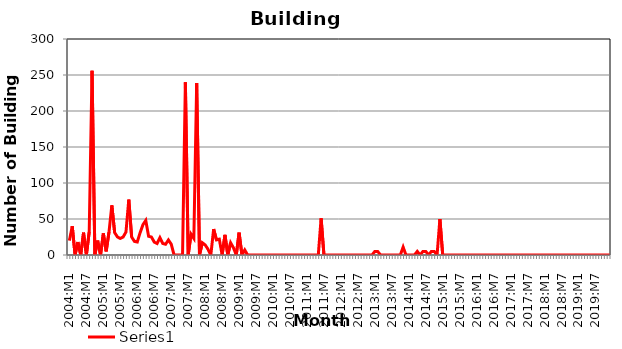
| Category | Series 0 |
|---|---|
| 2004:M1 | 20 |
| 2004:M2 | 40 |
| 2004:M3 | 0 |
| 2004:M4 | 18 |
| 2004:M5 | 0 |
| 2004:M6 | 31 |
| 2004:M7 | 0 |
| 2004:M8 | 32 |
| 2004:M9 | 256 |
| 2004:M10 | 0 |
| 2004:M11 | 20 |
| 2004:M12 | 0 |
| 2005:M1 | 30 |
| 2005:M2 | 5 |
| 2005:M3 | 32 |
| 2005:M4 | 69 |
| 2005:M5 | 31 |
| 2005:M6 | 25 |
| 2005:M7 | 23 |
| 2005:M8 | 25 |
| 2005:M9 | 32 |
| 2005:M10 | 77 |
| 2005:M11 | 25 |
| 2005:M12 | 19 |
| 2006:M1 | 18 |
| 2006:M2 | 31 |
| 2006:M3 | 42 |
| 2006:M4 | 48 |
| 2006:M5 | 26 |
| 2006:M6 | 25 |
| 2006:M7 | 18 |
| 2006:M8 | 16 |
| 2006:M9 | 24 |
| 2006:M10 | 16 |
| 2006:M11 | 15 |
| 2006:M12 | 21 |
| 2007:M1 | 15 |
| 2007:M2 | 0 |
| 2007:M3 | 0 |
| 2007:M4 | 0 |
| 2007:M5 | 0 |
| 2007:M6 | 240 |
| 2007:M7 | 0 |
| 2007:M8 | 29 |
| 2007:M9 | 23 |
| 2007:M10 | 239 |
| 2007:M11 | 0 |
| 2007:M12 | 17 |
| 2008:M1 | 14 |
| 2008:M2 | 8 |
| 2008:M3 | 0 |
| 2008:M4 | 36 |
| 2008:M5 | 21 |
| 2008:M6 | 22 |
| 2008:M7 | 0 |
| 2008:M8 | 28 |
| 2008:M9 | 0 |
| 2008:M10 | 17 |
| 2008:M11 | 10 |
| 2008:M12 | 0 |
| 2009:M1 | 31 |
| 2009:M2 | 0 |
| 2009:M3 | 7 |
| 2009:M4 | 0 |
| 2009:M5 | 0 |
| 2009:M6 | 0 |
| 2009:M7 | 0 |
| 2009:M8 | 0 |
| 2009:M9 | 0 |
| 2009:M10 | 0 |
| 2009:M11 | 0 |
| 2009:M12 | 0 |
| 2010:M1 | 0 |
| 2010:M2 | 0 |
| 2010:M3 | 0 |
| 2010:M4 | 0 |
| 2010:M5 | 0 |
| 2010:M6 | 0 |
| 2010:M7 | 0 |
| 2010:M8 | 0 |
| 2010:M9 | 0 |
| 2010:M10 | 0 |
| 2010:M11 | 0 |
| 2010:M12 | 0 |
| 2011:M1 | 0 |
| 2011:M2 | 0 |
| 2011:M3 | 0 |
| 2011:M4 | 0 |
| 2011:M5 | 0 |
| 2011:M6 | 51 |
| 2011:M7 | 0 |
| 2011:M8 | 0 |
| 2011:M9 | 0 |
| 2011:M10 | 0 |
| 2011:M11 | 0 |
| 2011:M12 | 0 |
| 2012:M1 | 0 |
| 2012:M2 | 0 |
| 2012:M3 | 0 |
| 2012:M4 | 0 |
| 2012:M5 | 0 |
| 2012:M6 | 0 |
| 2012:M7 | 0 |
| 2012:M8 | 0 |
| 2012:M9 | 0 |
| 2012:M10 | 0 |
| 2012:M11 | 0 |
| 2012:M12 | 0 |
| 2013:M1 | 5 |
| 2013:M2 | 5 |
| 2013:M3 | 0 |
| 2013:M4 | 0 |
| 2013:M5 | 0 |
| 2013:M6 | 0 |
| 2013:M7 | 0 |
| 2013:M8 | 0 |
| 2013:M9 | 0 |
| 2013:M10 | 0 |
| 2013:M11 | 11 |
| 2013:M12 | 0 |
| 2014:M1 | 0 |
| 2014:M2 | 0 |
| 2014:M3 | 0 |
| 2014:M4 | 5 |
| 2014:M5 | 0 |
| 2014:M6 | 5 |
| 2014:M7 | 5 |
| 2014:M8 | 0 |
| 2014:M9 | 5 |
| 2014:M10 | 5 |
| 2014:M11 | 0 |
| 2014:M12 | 50 |
| 2015:M1 | 0 |
| 2015:M2 | 0 |
| 2015:M3 | 0 |
| 2015:M4 | 0 |
| 2015:M5 | 0 |
| 2015:M6 | 0 |
| 2015:M7 | 0 |
| 2015:M8 | 0 |
| 2015:M9 | 0 |
| 2015:M10 | 0 |
| 2015:M11 | 0 |
| 2015:M12 | 0 |
| 2016:M1 | 0 |
| 2016:M2 | 0 |
| 2016:M3 | 0 |
| 2016:M4 | 0 |
| 2016:M5 | 0 |
| 2016:M6 | 0 |
| 2016:M7 | 0 |
| 2016:M8 | 0 |
| 2016:M9 | 0 |
| 2016:M10 | 0 |
| 2016:M11 | 0 |
| 2016:M12 | 0 |
| 2017:M1 | 0 |
| 2017:M2 | 0 |
| 2017:M3 | 0 |
| 2017:M4 | 0 |
| 2017:M5 | 0 |
| 2017:M6 | 0 |
| 2017:M7 | 0 |
| 2017:M8 | 0 |
| 2017:M9 | 0 |
| 2017:M10 | 0 |
| 2017:M11 | 0 |
| 2017:M12 | 0 |
| 2018:M1 | 0 |
| 2018:M2 | 0 |
| 2018:M3 | 0 |
| 2018:M4 | 0 |
| 2018:M5 | 0 |
| 2018:M6 | 0 |
| 2018:M7 | 0 |
| 2018:M8 | 0 |
| 2018:M9 | 0 |
| 2018:M10 | 0 |
| 2018:M11 | 0 |
| 2018:M12 | 0 |
| 2019:M1 | 0 |
| 2019:M2 | 0 |
| 2019:M3 | 0 |
| 2019:M4 | 0 |
| 2019:M5 | 0 |
| 2019:M6 | 0 |
| 2019:M7 | 0 |
| 2019:M8 | 0 |
| 2019:M9 | 0 |
| 2019:M10 | 0 |
| 2019:M11 | 0 |
| 2019:M12 | 0 |